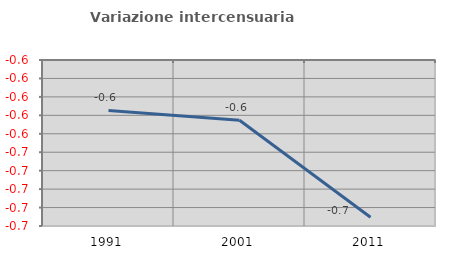
| Category | Variazione intercensuaria annua |
|---|---|
| 1991.0 | -0.615 |
| 2001.0 | -0.625 |
| 2011.0 | -0.73 |